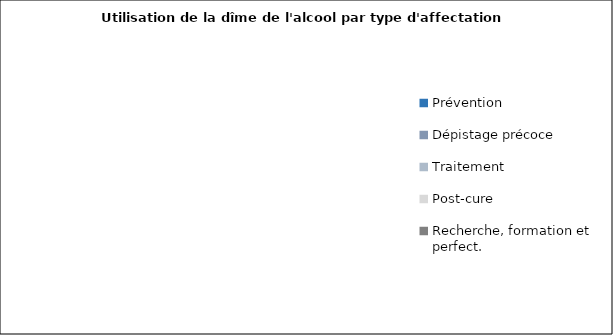
| Category | Series 0 |
|---|---|
| Prévention | 0 |
| Dépistage précoce | 0 |
| Traitement | 0 |
| Post-cure | 0 |
| Recherche, formation et perfect. | 0 |